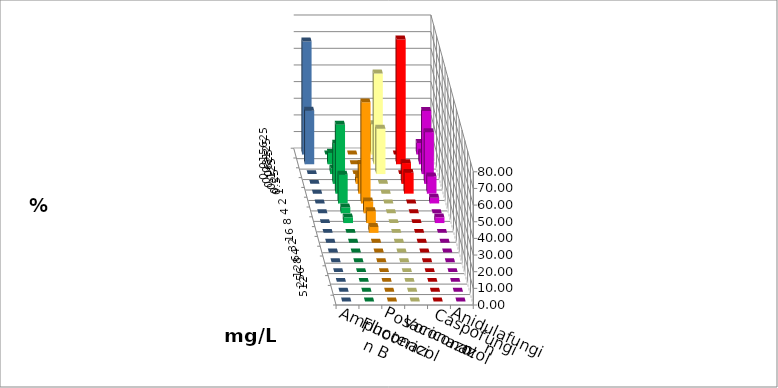
| Category | Amphotericin B | Fluconazol | Posaconazol | Voriconazol | Caspofungin | Anidulafungin |
|---|---|---|---|---|---|---|
| 0.015625 | 0 | 0 | 18.182 | 0 | 6.897 | 67.857 |
| 0.03125 | 6.897 | 0 | 54.545 | 75 | 6.897 | 32.143 |
| 0.0625 | 3.448 | 0 | 27.273 | 0 | 37.931 | 0 |
| 0.125 | 24.138 | 3.571 | 0 | 12.5 | 31.034 | 0 |
| 0.25 | 41.379 | 17.857 | 0 | 12.5 | 10.345 | 0 |
| 0.5 | 17.241 | 60.714 | 0 | 0 | 3.448 | 0 |
| 1.0 | 3.448 | 7.143 | 0 | 0 | 0 | 0 |
| 2.0 | 3.448 | 7.143 | 0 | 0 | 3.448 | 0 |
| 4.0 | 0 | 3.571 | 0 | 0 | 0 | 0 |
| 8.0 | 0 | 0 | 0 | 0 | 0 | 0 |
| 16.0 | 0 | 0 | 0 | 0 | 0 | 0 |
| 32.0 | 0 | 0 | 0 | 0 | 0 | 0 |
| 64.0 | 0 | 0 | 0 | 0 | 0 | 0 |
| 128.0 | 0 | 0 | 0 | 0 | 0 | 0 |
| 256.0 | 0 | 0 | 0 | 0 | 0 | 0 |
| 512.0 | 0 | 0 | 0 | 0 | 0 | 0 |